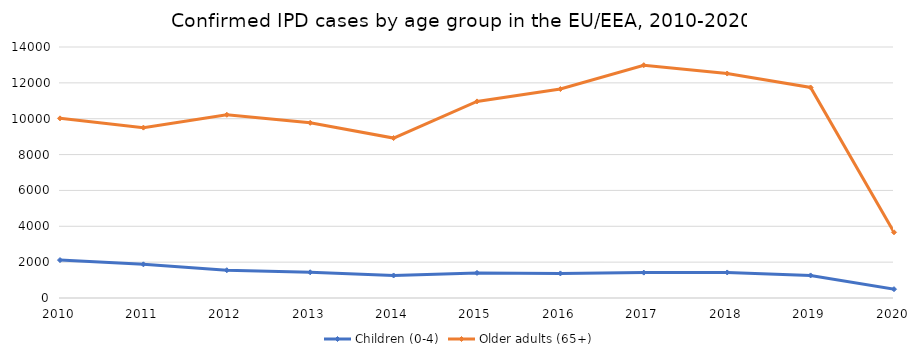
| Category | Children (0-4) | Older adults (65+) |
|---|---|---|
| 2010.0 | 2116 | 10020 |
| 2011.0 | 1877 | 9503 |
| 2012.0 | 1550 | 10221 |
| 2013.0 | 1435 | 9772 |
| 2014.0 | 1256 | 8920 |
| 2015.0 | 1400 | 10965 |
| 2016.0 | 1371 | 11654 |
| 2017.0 | 1416 | 12985 |
| 2018.0 | 1425 | 12520 |
| 2019.0 | 1259 | 11742 |
| 2020.0 | 492 | 3666 |